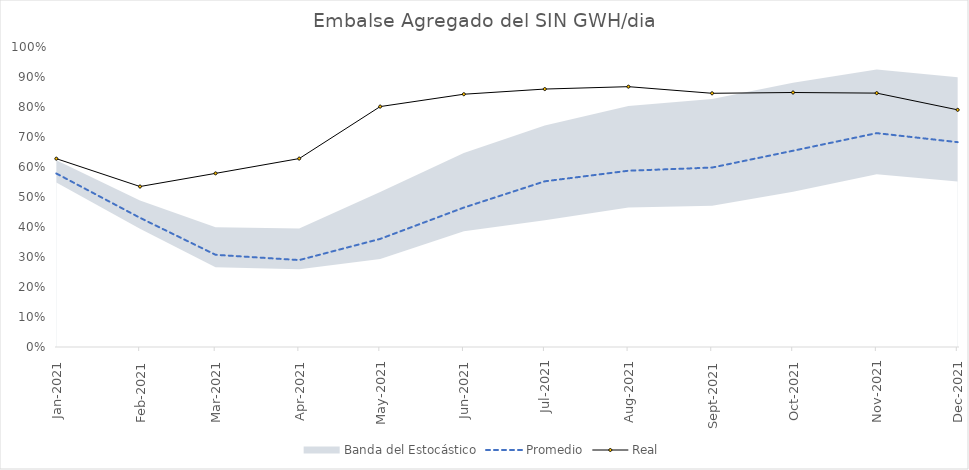
| Category | Promedio | Real |
|---|---|---|
| 2021-01-01 | 0.578 | 0.628 |
| 2021-02-01 | 0.431 | 0.535 |
| 2021-03-01 | 0.307 | 0.579 |
| 2021-04-01 | 0.29 | 0.628 |
| 2021-05-01 | 0.36 | 0.801 |
| 2021-06-01 | 0.465 | 0.843 |
| 2021-07-01 | 0.552 | 0.86 |
| 2021-08-01 | 0.588 | 0.868 |
| 2021-09-01 | 0.598 | 0.846 |
| 2021-10-01 | 0.654 | 0.848 |
| 2021-11-01 | 0.713 | 0.846 |
| 2021-12-01 | 0.683 | 0.79 |